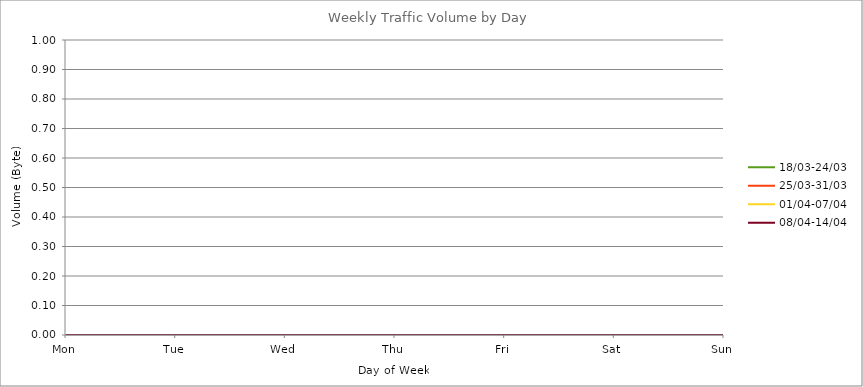
| Category | 18/03-24/03 | 25/03-31/03 | 01/04-07/04 | 08/04-14/04 |
|---|---|---|---|---|
| Mon | 0 | 0 | 0 | 0 |
| Tue | 0 | 0 | 0 | 0 |
| Wed | 0 | 0 | 0 | 0 |
| Thu | 0 | 0 | 0 | 0 |
| Fri | 0 | 0 | 0 | 0 |
| Sat | 0 | 0 | 0 | 0 |
| Sun | 0 | 0 | 0 | 0 |